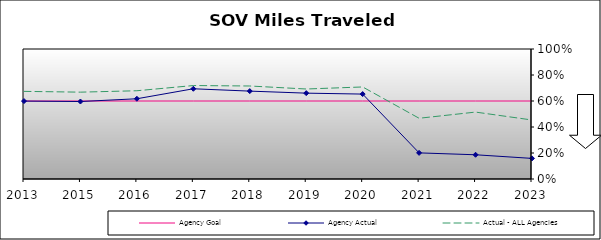
| Category | Agency Goal | Agency Actual | Actual - ALL Agencies |
|---|---|---|---|
| 2013.0 | 0.6 | 0.599 | 0.674 |
| 2015.0 | 0.6 | 0.596 | 0.668 |
| 2016.0 | 0.6 | 0.617 | 0.679 |
| 2017.0 | 0.6 | 0.694 | 0.719 |
| 2018.0 | 0.6 | 0.676 | 0.715 |
| 2019.0 | 0.6 | 0.66 | 0.692 |
| 2020.0 | 0.6 | 0.653 | 0.708 |
| 2021.0 | 0.6 | 0.201 | 0.467 |
| 2022.0 | 0.6 | 0.186 | 0.515 |
| 2023.0 | 0.6 | 0.158 | 0.454 |